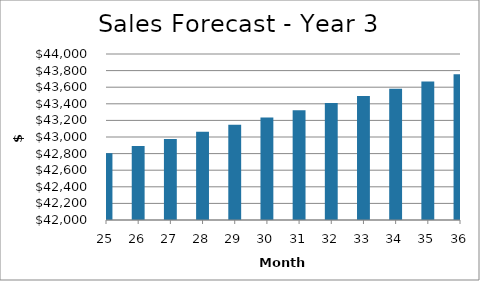
| Category | Year 3 |
|---|---|
| 25.0 | 42805.136 |
| 26.0 | 42890.789 |
| 27.0 | 42976.614 |
| 28.0 | 43062.61 |
| 29.0 | 43148.778 |
| 30.0 | 43235.119 |
| 31.0 | 43321.632 |
| 32.0 | 43408.319 |
| 33.0 | 43495.179 |
| 34.0 | 43582.213 |
| 35.0 | 43669.421 |
| 36.0 | 43756.803 |